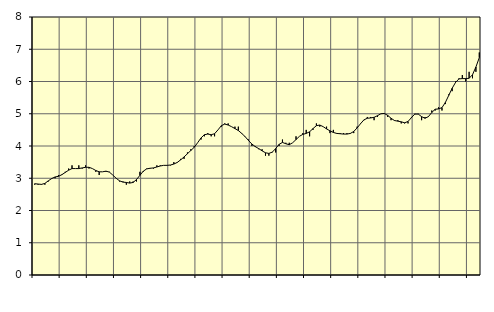
| Category | Piggar | Information och kommunikation, SNI 58-63 |
|---|---|---|
| nan | 2.8 | 2.83 |
| 87.0 | 2.8 | 2.82 |
| 87.0 | 2.8 | 2.81 |
| 87.0 | 2.8 | 2.84 |
| nan | 2.9 | 2.92 |
| 88.0 | 3 | 2.99 |
| 88.0 | 3 | 3.04 |
| 88.0 | 3.1 | 3.06 |
| nan | 3.1 | 3.11 |
| 89.0 | 3.2 | 3.18 |
| 89.0 | 3.3 | 3.25 |
| 89.0 | 3.4 | 3.3 |
| nan | 3.3 | 3.3 |
| 90.0 | 3.4 | 3.3 |
| 90.0 | 3.3 | 3.32 |
| 90.0 | 3.4 | 3.34 |
| nan | 3.3 | 3.34 |
| 91.0 | 3.3 | 3.3 |
| 91.0 | 3.2 | 3.24 |
| 91.0 | 3.1 | 3.2 |
| nan | 3.2 | 3.2 |
| 92.0 | 3.2 | 3.22 |
| 92.0 | 3.2 | 3.19 |
| 92.0 | 3.1 | 3.1 |
| nan | 3 | 3 |
| 93.0 | 2.9 | 2.92 |
| 93.0 | 2.9 | 2.88 |
| 93.0 | 2.8 | 2.87 |
| nan | 2.9 | 2.85 |
| 94.0 | 2.9 | 2.87 |
| 94.0 | 2.9 | 2.96 |
| 94.0 | 3.2 | 3.09 |
| nan | 3.2 | 3.22 |
| 95.0 | 3.3 | 3.29 |
| 95.0 | 3.3 | 3.31 |
| 95.0 | 3.3 | 3.32 |
| nan | 3.4 | 3.35 |
| 96.0 | 3.4 | 3.38 |
| 96.0 | 3.4 | 3.4 |
| 96.0 | 3.4 | 3.4 |
| nan | 3.4 | 3.41 |
| 97.0 | 3.5 | 3.44 |
| 97.0 | 3.5 | 3.49 |
| 97.0 | 3.6 | 3.57 |
| nan | 3.6 | 3.66 |
| 98.0 | 3.8 | 3.76 |
| 98.0 | 3.9 | 3.86 |
| 98.0 | 4 | 3.96 |
| nan | 4.1 | 4.1 |
| 99.0 | 4.2 | 4.25 |
| 99.0 | 4.3 | 4.35 |
| 99.0 | 4.4 | 4.37 |
| nan | 4.3 | 4.35 |
| 0.0 | 4.3 | 4.38 |
| 0.0 | 4.5 | 4.5 |
| 0.0 | 4.6 | 4.63 |
| nan | 4.7 | 4.68 |
| 1.0 | 4.7 | 4.65 |
| 1.0 | 4.6 | 4.6 |
| 1.0 | 4.6 | 4.54 |
| nan | 4.6 | 4.48 |
| 2.0 | 4.4 | 4.39 |
| 2.0 | 4.3 | 4.29 |
| 2.0 | 4.2 | 4.17 |
| nan | 4 | 4.06 |
| 3.0 | 4 | 3.98 |
| 3.0 | 3.9 | 3.92 |
| 3.0 | 3.9 | 3.85 |
| nan | 3.7 | 3.79 |
| 4.0 | 3.7 | 3.77 |
| 4.0 | 3.8 | 3.81 |
| 4.0 | 3.8 | 3.92 |
| nan | 4 | 4.05 |
| 5.0 | 4.2 | 4.11 |
| 5.0 | 4.1 | 4.07 |
| 5.0 | 4.1 | 4.04 |
| nan | 4.1 | 4.1 |
| 6.0 | 4.3 | 4.2 |
| 6.0 | 4.3 | 4.3 |
| 6.0 | 4.4 | 4.36 |
| nan | 4.5 | 4.39 |
| 7.0 | 4.3 | 4.44 |
| 7.0 | 4.5 | 4.54 |
| 7.0 | 4.7 | 4.63 |
| nan | 4.6 | 4.65 |
| 8.0 | 4.6 | 4.6 |
| 8.0 | 4.6 | 4.53 |
| 8.0 | 4.4 | 4.47 |
| nan | 4.5 | 4.42 |
| 9.0 | 4.4 | 4.39 |
| 9.0 | 4.4 | 4.38 |
| 9.0 | 4.4 | 4.37 |
| nan | 4.4 | 4.37 |
| 10.0 | 4.4 | 4.39 |
| 10.0 | 4.4 | 4.45 |
| 10.0 | 4.6 | 4.56 |
| nan | 4.7 | 4.69 |
| 11.0 | 4.8 | 4.81 |
| 11.0 | 4.9 | 4.86 |
| 11.0 | 4.9 | 4.87 |
| nan | 4.8 | 4.89 |
| 12.0 | 4.9 | 4.94 |
| 12.0 | 5 | 5 |
| 12.0 | 5 | 5.01 |
| nan | 4.9 | 4.95 |
| 13.0 | 4.8 | 4.86 |
| 13.0 | 4.8 | 4.79 |
| 13.0 | 4.8 | 4.77 |
| nan | 4.7 | 4.75 |
| 14.0 | 4.7 | 4.72 |
| 14.0 | 4.7 | 4.76 |
| 14.0 | 4.9 | 4.88 |
| nan | 5 | 4.99 |
| 15.0 | 5 | 4.99 |
| 15.0 | 4.8 | 4.91 |
| 15.0 | 4.9 | 4.86 |
| nan | 4.9 | 4.91 |
| 16.0 | 5.1 | 5.04 |
| 16.0 | 5.1 | 5.14 |
| 16.0 | 5.2 | 5.15 |
| nan | 5.1 | 5.19 |
| 17.0 | 5.3 | 5.35 |
| 17.0 | 5.6 | 5.57 |
| 17.0 | 5.7 | 5.79 |
| nan | 6 | 5.97 |
| 18.0 | 6.1 | 6.08 |
| 18.0 | 6.2 | 6.09 |
| 18.0 | 6 | 6.09 |
| nan | 6.3 | 6.1 |
| 19.0 | 6.1 | 6.21 |
| 19.0 | 6.3 | 6.45 |
| 19.0 | 6.9 | 6.74 |